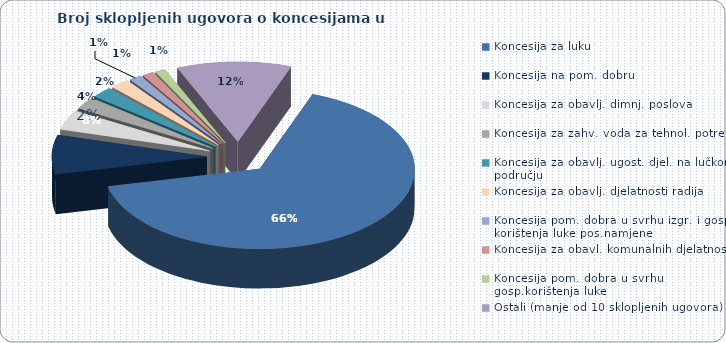
| Category | Series 0 |
|---|---|
| Koncesija za luku | 597 |
| Koncesija na pom. dobru | 72 |
| Koncesija za obavlj. dimnj. poslova | 36 |
| Koncesija za zahv. voda za tehnol. potrebe | 22 |
| Koncesija za obavlj. ugost. djel. na lučkom području | 20 |
| Koncesija za obavlj. djelatnosti radija | 18 |
| Koncesija pom. dobra u svrhu izgr. i gosp. korištenja luke pos.namjene | 12 |
| Koncesija za obavl. komunalnih djelatnosti | 11 |
| Koncesija pom. dobra u svrhu gosp.korištenja luke | 10 |
| Ostali (manje od 10 sklopljenih ugovora) | 108 |